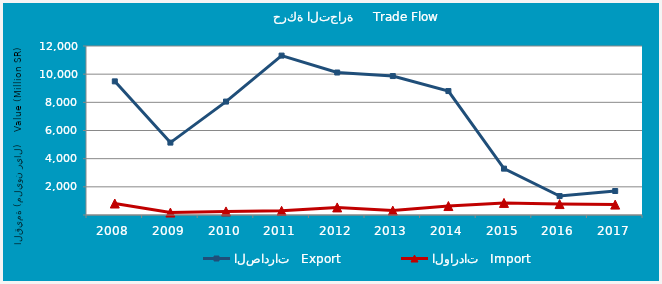
| Category | الصادرات   Export | الواردات   Import |
|---|---|---|
| 2008.0 | 9488960713 | 814665859 |
| 2009.0 | 5140500434 | 174086110 |
| 2010.0 | 8052891625 | 253474324 |
| 2011.0 | 11318105347 | 297469635 |
| 2012.0 | 10116574520 | 538073582 |
| 2013.0 | 9866215725 | 313799131 |
| 2014.0 | 8800622092 | 636507224 |
| 2015.0 | 3292264174 | 857952385 |
| 2016.0 | 1345268183 | 775676995 |
| 2017.0 | 1703841256 | 738523854 |